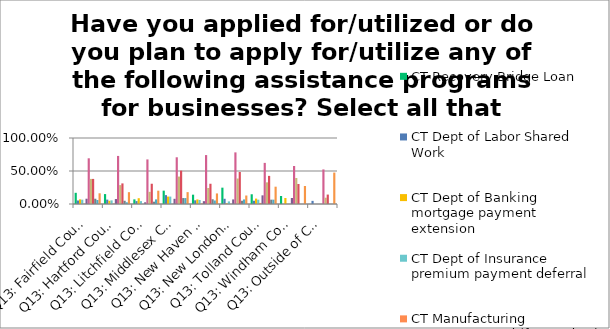
| Category | CT Recovery Bridge Loan | CT Dept of Labor Shared Work | CT Dept of Banking mortgage payment extension | CT Dept of Insurance premium payment deferral | CT Manufacturing Innovation Fund (for medical supplies manufacturers) | HEDCO Line of Credit (for women and minority owned businesses) | SBA Paycheck Protection Program (PPP) | SBA Economic Injury Disaster Loan | SBA Economic Injury Disaster Loan Advance (Grant) | SBA Small Business Bridge Loan | SBA Small Business Debt Relief | Do not plan to apply for any assistance programs (why not?) |
|---|---|---|---|---|---|---|---|---|---|---|---|---|
| Q13: Fairfield County | 0.17 | 0.053 | 0.07 | 0.065 | 0.005 | 0.08 | 0.692 | 0.38 | 0.38 | 0.08 | 0.06 | 0.162 |
| Q13: Hartford County | 0.15 | 0.066 | 0.049 | 0.055 | 0.006 | 0.075 | 0.728 | 0.286 | 0.312 | 0.049 | 0.026 | 0.179 |
| Q13: Litchfield County | 0.07 | 0.044 | 0.088 | 0.044 | 0 | 0.026 | 0.675 | 0.184 | 0.307 | 0.035 | 0.07 | 0.202 |
| Q13: Middlesex County | 0.202 | 0.135 | 0.112 | 0.112 | 0 | 0.079 | 0.708 | 0.416 | 0.506 | 0.09 | 0.09 | 0.18 |
| Q13: New Haven County | 0.141 | 0.056 | 0.069 | 0.061 | 0.008 | 0.043 | 0.741 | 0.243 | 0.307 | 0.072 | 0.053 | 0.16 |
| Q13: New London County | 0.248 | 0.079 | 0.01 | 0.04 | 0 | 0.069 | 0.782 | 0.386 | 0.485 | 0.05 | 0.069 | 0.129 |
| Q13: Tolland County | 0.148 | 0.049 | 0.082 | 0.066 | 0.016 | 0.131 | 0.623 | 0.328 | 0.426 | 0.066 | 0.066 | 0.262 |
| Q13: Windham County | 0.121 | 0 | 0.091 | 0 | 0 | 0.091 | 0.576 | 0.394 | 0.303 | 0 | 0 | 0.273 |
| Q13: Outside of Connecticut | 0 | 0.048 | 0 | 0 | 0 | 0 | 0.524 | 0.095 | 0.143 | 0 | 0 | 0.476 |